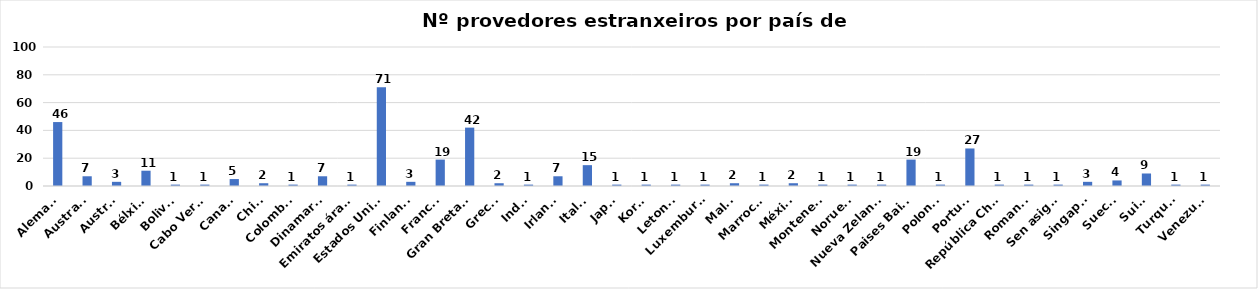
| Category | Series 0 |
|---|---|
| Alemaña | 46 |
| Australia | 7 |
| Austria | 3 |
| Bélxica | 11 |
| Bolivia | 1 |
| Cabo Verde | 1 |
| Canadá | 5 |
| China | 2 |
| Colombia | 1 |
| Dinamarca | 7 |
| Emiratos árabes | 1 |
| Estados Unidos | 71 |
| Finlandia | 3 |
| Francia | 19 |
| Gran Bretaña | 42 |
| Grecia | 2 |
| India | 1 |
| Irlanda | 7 |
| Italia | 15 |
| Japón | 1 |
| Korea | 1 |
| Letonia | 1 |
| Luxemburgo | 1 |
| Malta | 2 |
| Marrocos | 1 |
| México | 2 |
| Montenegro | 1 |
| Noruega | 1 |
| Nueva Zelanda | 1 |
| Paises Baixos | 19 |
| Polonia | 1 |
| Portugal | 27 |
| República Checa | 1 |
| Romanía | 1 |
| Sen asignar | 1 |
| Singapur | 3 |
| Suecia | 4 |
| Suiza | 9 |
| Turquía | 1 |
| Venezuela | 1 |